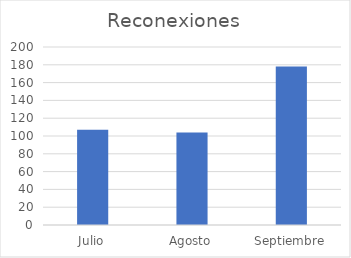
| Category | Reconexiones |
|---|---|
| Julio | 107 |
| Agosto | 104 |
| Septiembre | 178 |